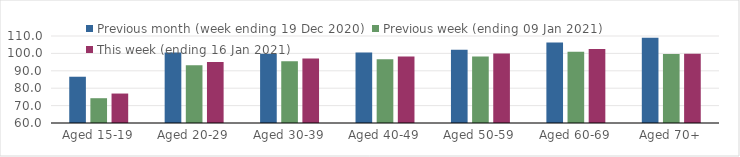
| Category | Previous month (week ending 19 Dec 2020) | Previous week (ending 09 Jan 2021) | This week (ending 16 Jan 2021) |
|---|---|---|---|
| Aged 15-19 | 86.59 | 74.25 | 76.93 |
| Aged 20-29 | 100.46 | 93.25 | 95.05 |
| Aged 30-39 | 99.78 | 95.56 | 97.02 |
| Aged 40-49 | 100.57 | 96.67 | 98.19 |
| Aged 50-59 | 102.12 | 98.22 | 99.95 |
| Aged 60-69 | 106.26 | 100.96 | 102.53 |
| Aged 70+ | 108.96 | 99.61 | 99.75 |